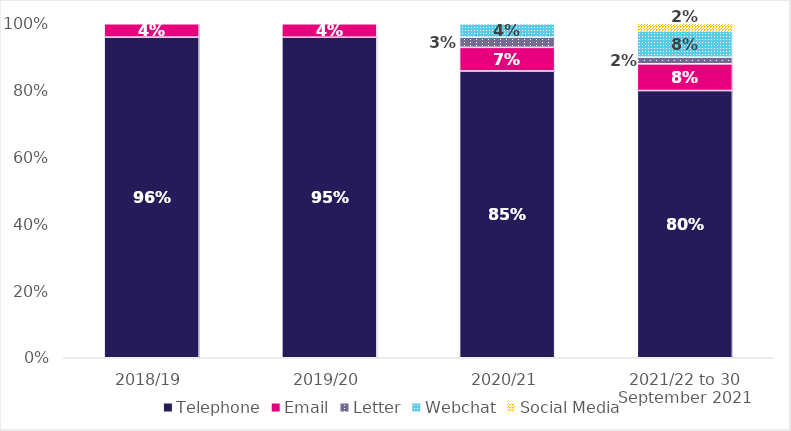
| Category | Telephone | Email | Letter | Webchat | Social Media |
|---|---|---|---|---|---|
| 2018/19 | 0.96 | 0.04 | 0 | 0 | 0 |
| 2019/20 | 0.95 | 0.04 | 0 | 0 | 0 |
| 2020/21 | 0.85 | 0.07 | 0.03 | 0.04 | 0 |
| 2021/22 to 30 September 2021 | 0.8 | 0.08 | 0.02 | 0.08 | 0.02 |